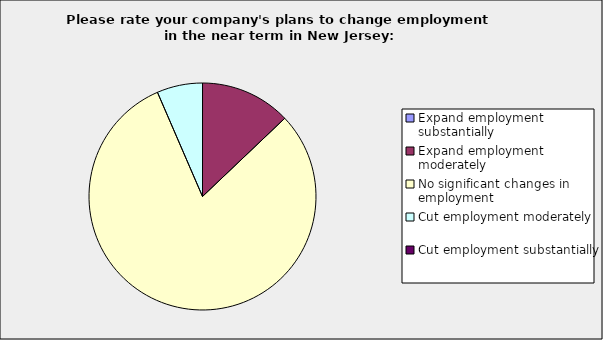
| Category | Series 0 |
|---|---|
| Expand employment substantially | 0 |
| Expand employment moderately | 0.129 |
| No significant changes in employment | 0.806 |
| Cut employment moderately | 0.065 |
| Cut employment substantially | 0 |